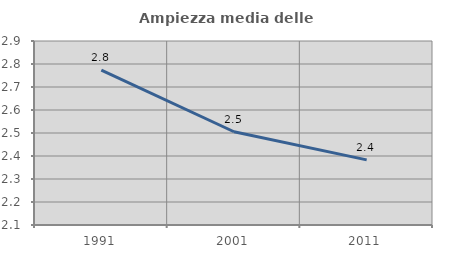
| Category | Ampiezza media delle famiglie |
|---|---|
| 1991.0 | 2.773 |
| 2001.0 | 2.505 |
| 2011.0 | 2.383 |